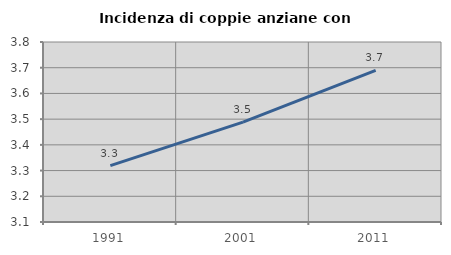
| Category | Incidenza di coppie anziane con figli |
|---|---|
| 1991.0 | 3.32 |
| 2001.0 | 3.488 |
| 2011.0 | 3.69 |